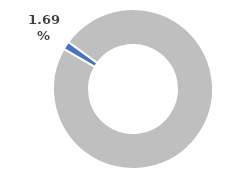
| Category | Series 0 |
|---|---|
| 0 | 0.017 |
| 1 | 0.983 |